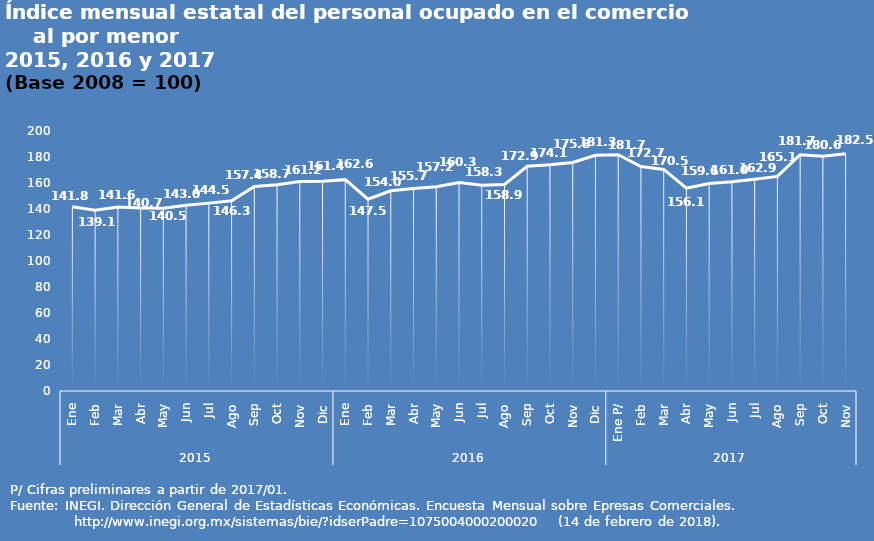
| Category | Series 0 |
|---|---|
| 0 | 141.77 |
| 1 | 139.1 |
| 2 | 141.558 |
| 3 | 140.735 |
| 4 | 140.546 |
| 5 | 142.967 |
| 6 | 144.522 |
| 7 | 146.295 |
| 8 | 157.356 |
| 9 | 158.711 |
| 10 | 161.225 |
| 11 | 161.43 |
| 12 | 162.584 |
| 13 | 147.53 |
| 14 | 154.018 |
| 15 | 155.744 |
| 16 | 157.161 |
| 17 | 160.346 |
| 18 | 158.257 |
| 19 | 158.889 |
| 20 | 172.905 |
| 21 | 174.059 |
| 22 | 175.78 |
| 23 | 181.313 |
| 24 | 181.748 |
| 25 | 172.723 |
| 26 | 170.465 |
| 27 | 156.064 |
| 28 | 159.644 |
| 29 | 160.982 |
| 30 | 162.927 |
| 31 | 165.072 |
| 32 | 181.703 |
| 33 | 180.614 |
| 34 | 182.453 |